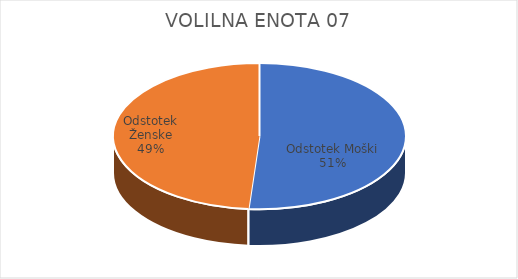
| Category | VOLILNA ENOTA 07 | #REF! | Slovenija skupaj |
|---|---|---|---|
| Odstotek Moški | 6.67 |  | 7.6 |
| Odstotek Ženske | 6.36 |  | 7.35 |